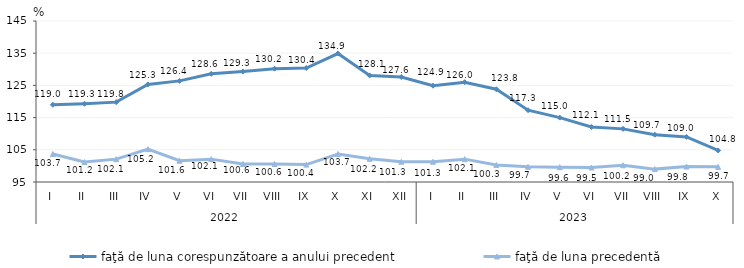
| Category | faţă de luna corespunzătoare a anului precedent | faţă de luna precedentă   |
|---|---|---|
| 0 | 119 | 103.7 |
| 1 | 119.3 | 101.2 |
| 2 | 119.8 | 102.1 |
| 3 | 125.3 | 105.2 |
| 4 | 126.4 | 101.6 |
| 5 | 128.6 | 102.1 |
| 6 | 129.3 | 100.6 |
| 7 | 130.2 | 100.6 |
| 8 | 130.4 | 100.4 |
| 9 | 134.9 | 103.7 |
| 10 | 128.1 | 102.2 |
| 11 | 127.6 | 101.3 |
| 12 | 124.9 | 101.3 |
| 13 | 126 | 102.1 |
| 14 | 123.8 | 100.3 |
| 15 | 117.3 | 99.7 |
| 16 | 115 | 99.6 |
| 17 | 112.1 | 99.5 |
| 18 | 111.5 | 100.2 |
| 19 | 109.7 | 99 |
| 20 | 109 | 99.8 |
| 21 | 104.8 | 99.7 |